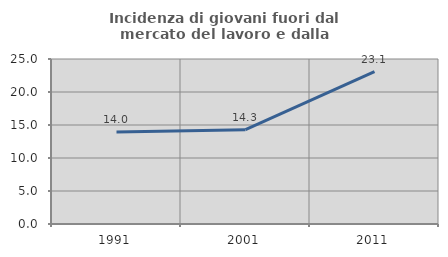
| Category | Incidenza di giovani fuori dal mercato del lavoro e dalla formazione  |
|---|---|
| 1991.0 | 13.953 |
| 2001.0 | 14.286 |
| 2011.0 | 23.077 |